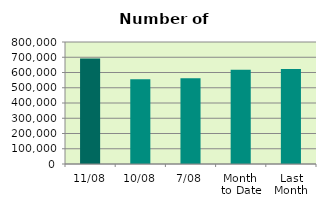
| Category | Series 0 |
|---|---|
| 11/08 | 692436 |
| 10/08 | 555490 |
| 7/08 | 562558 |
| Month 
to Date | 618681.143 |
| Last
Month | 622411.826 |